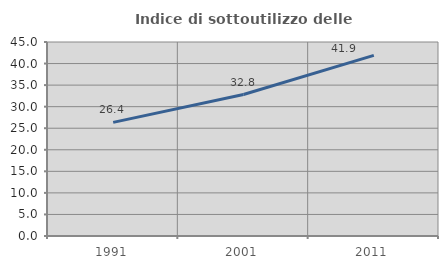
| Category | Indice di sottoutilizzo delle abitazioni  |
|---|---|
| 1991.0 | 26.358 |
| 2001.0 | 32.817 |
| 2011.0 | 41.9 |